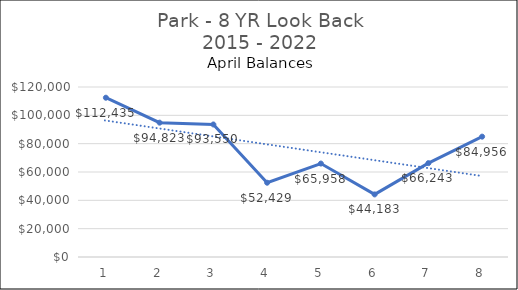
| Category | Park |
|---|---|
| 0 | 112434.71 |
| 1 | 94822.8 |
| 2 | 93549.75 |
| 3 | 52429.11 |
| 4 | 65957.57 |
| 5 | 44182.55 |
| 6 | 66243.03 |
| 7 | 84956.21 |